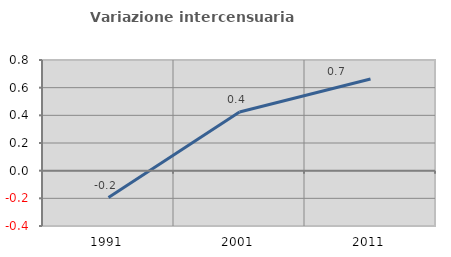
| Category | Variazione intercensuaria annua |
|---|---|
| 1991.0 | -0.194 |
| 2001.0 | 0.424 |
| 2011.0 | 0.663 |